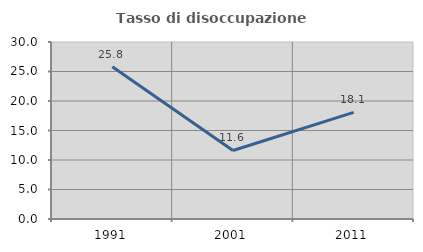
| Category | Tasso di disoccupazione giovanile  |
|---|---|
| 1991.0 | 25.806 |
| 2001.0 | 11.616 |
| 2011.0 | 18.065 |